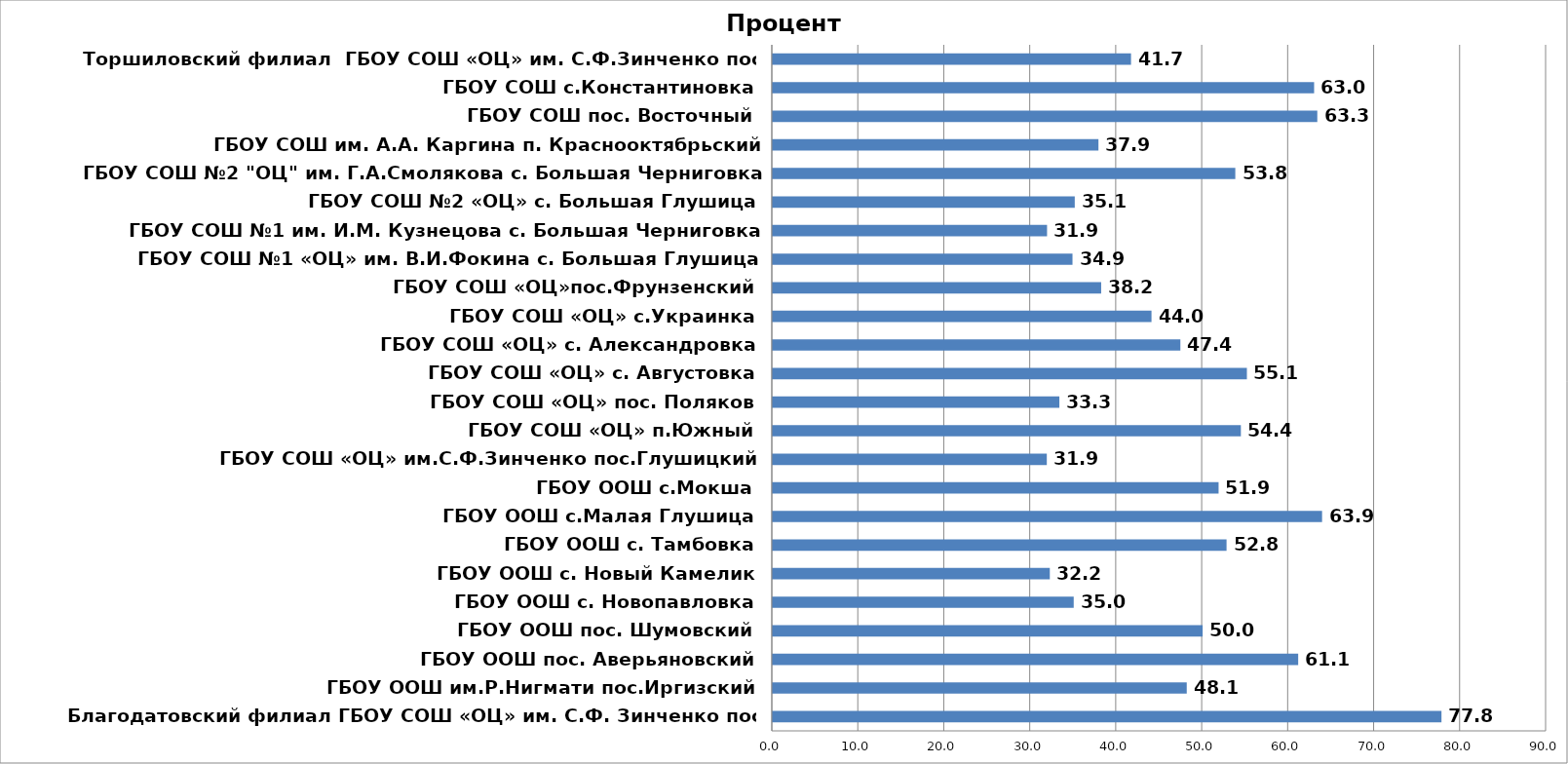
| Category | Series 0 |
|---|---|
| Благодатовский филиал ГБОУ СОШ «ОЦ» им. С.Ф. Зинченко пос. Глушицкий | 77.778 |
| ГБОУ ООШ им.Р.Нигмати пос.Иргизский | 48.148 |
| ГБОУ ООШ пос. Аверьяновский | 61.111 |
| ГБОУ ООШ пос. Шумовский | 50 |
| ГБОУ ООШ с. Новопавловка | 35 |
| ГБОУ ООШ с. Новый Камелик | 32.222 |
| ГБОУ ООШ с. Тамбовка | 52.778 |
| ГБОУ ООШ с.Малая Глушица | 63.889 |
| ГБОУ ООШ с.Мокша | 51.852 |
| ГБОУ СОШ «ОЦ» им.С.Ф.Зинченко пос.Глушицкий | 31.871 |
| ГБОУ СОШ «ОЦ» п.Южный | 54.444 |
| ГБОУ СОШ «ОЦ» пос. Поляков | 33.333 |
| ГБОУ СОШ «ОЦ» с. Августовка | 55.144 |
| ГБОУ СОШ «ОЦ» с. Александровка | 47.407 |
| ГБОУ СОШ «ОЦ» с.Украинка | 44.048 |
| ГБОУ СОШ «ОЦ»пос.Фрунзенский | 38.194 |
| ГБОУ СОШ №1 «ОЦ» им. В.И.Фокина с. Большая Глушица | 34.858 |
| ГБОУ СОШ №1 им. И.М. Кузнецова с. Большая Черниговка | 31.9 |
| ГБОУ СОШ №2 «ОЦ» с. Большая Глушица | 35.122 |
| ГБОУ СОШ №2 "ОЦ" им. Г.А.Смолякова с. Большая Черниговка | 53.796 |
| ГБОУ СОШ им. А.А. Каргина п. Краснооктябрьский | 37.879 |
| ГБОУ СОШ пос. Восточный | 63.333 |
| ГБОУ СОШ с.Константиновка | 62.963 |
| Торшиловский филиал  ГБОУ СОШ «ОЦ» им. С.Ф.Зинченко пос. Глушицкий | 41.667 |